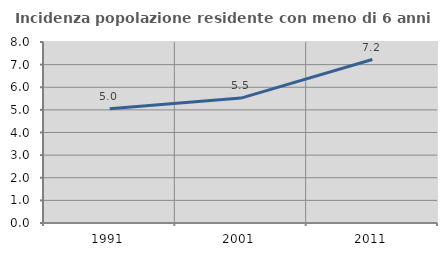
| Category | Incidenza popolazione residente con meno di 6 anni |
|---|---|
| 1991.0 | 5.045 |
| 2001.0 | 5.52 |
| 2011.0 | 7.225 |